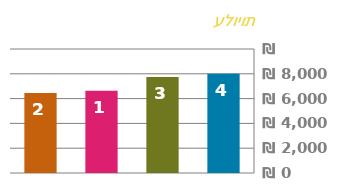
| Category | תשלום |
|---|---|
| 0 | 8000 |
| 1 | 7750 |
| 2 | 6625 |
| 3 | 6450 |